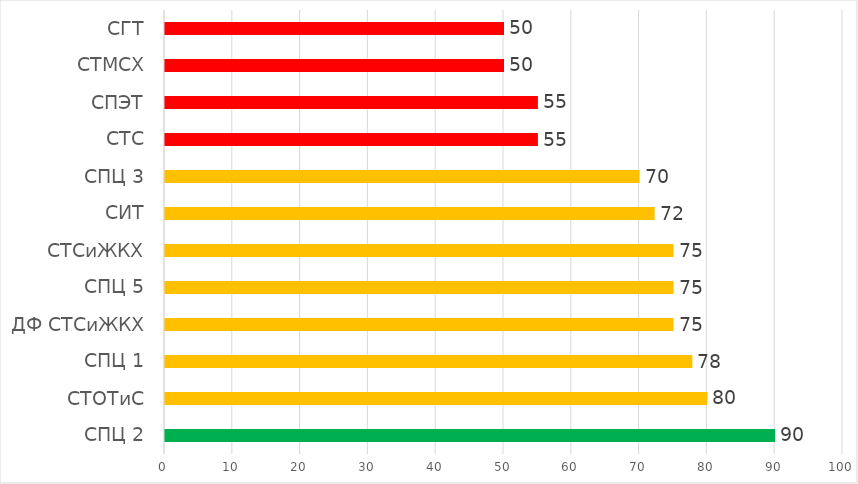
| Category | Series 0 |
|---|---|
| СПЦ 2 | 90 |
| СТОТиС | 80 |
| СПЦ 1 | 77.778 |
| ДФ СТСиЖКХ | 75 |
| СПЦ 5 | 75 |
| СТСиЖКХ | 75 |
| СИТ | 72.222 |
| СПЦ 3 | 70 |
| СТС | 55 |
| СПЭТ | 55 |
| СТМСХ | 50 |
| СГТ | 50 |